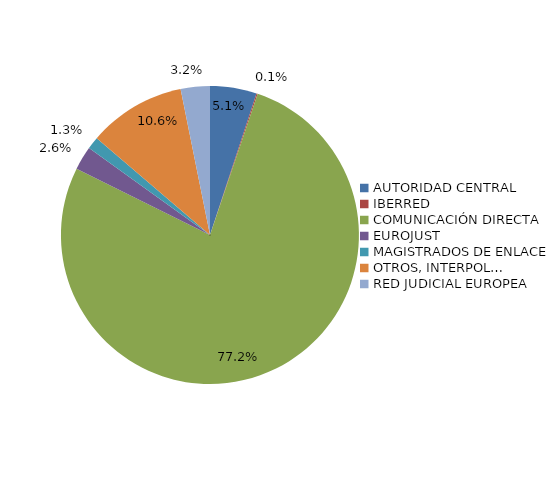
| Category | Series 0 |
|---|---|
| AUTORIDAD CENTRAL | 302 |
| IBERRED | 8 |
| COMUNICACIÓN DIRECTA | 4610 |
| EUROJUST | 154 |
| MAGISTRADOS DE ENLACE | 80 |
| OTROS, INTERPOL… | 632 |
| RED JUDICIAL EUROPEA | 189 |